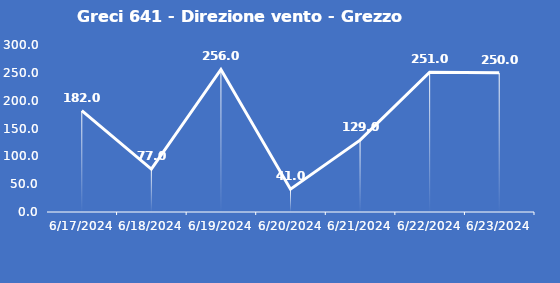
| Category | Greci 641 - Direzione vento - Grezzo (°N) |
|---|---|
| 6/17/24 | 182 |
| 6/18/24 | 77 |
| 6/19/24 | 256 |
| 6/20/24 | 41 |
| 6/21/24 | 129 |
| 6/22/24 | 251 |
| 6/23/24 | 250 |